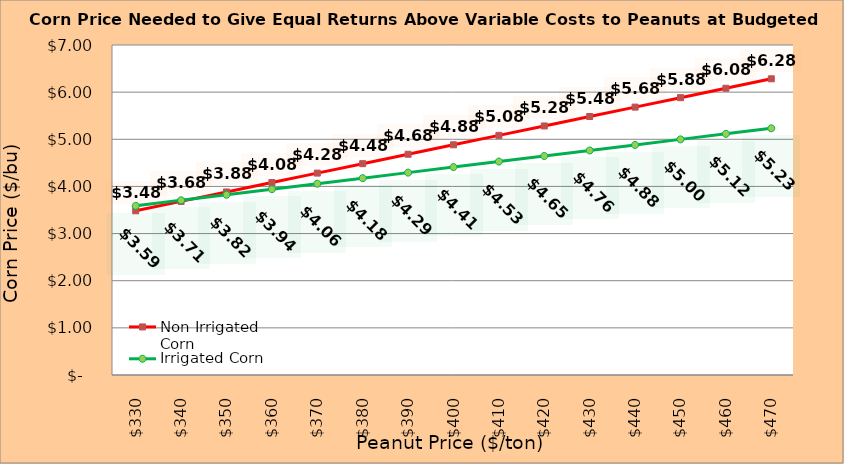
| Category | Non Irrigated Corn | Irrigated Corn |
|---|---|---|
| 330.0 | 3.483 | 3.588 |
| 340.0 | 3.683 | 3.705 |
| 350.0 | 3.883 | 3.823 |
| 360.0 | 4.083 | 3.94 |
| 370.0 | 4.283 | 4.058 |
| 380.0 | 4.483 | 4.175 |
| 390.0 | 4.683 | 4.293 |
| 400.0 | 4.883 | 4.41 |
| 410.0 | 5.083 | 4.528 |
| 420.0 | 5.283 | 4.645 |
| 430.0 | 5.483 | 4.763 |
| 440.0 | 5.683 | 4.88 |
| 450.0 | 5.883 | 4.998 |
| 460.0 | 6.083 | 5.115 |
| 470.0 | 6.283 | 5.233 |